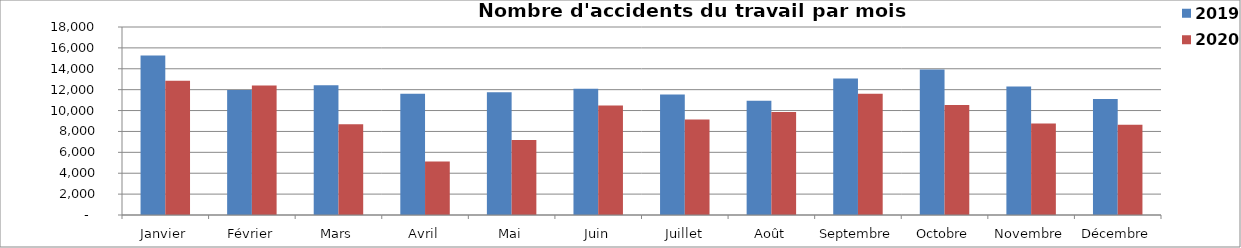
| Category | 2019 | 2020 |
|---|---|---|
| Janvier | 15269 | 12863 |
| Février | 11960 | 12403 |
| Mars | 12420 | 8677 |
| Avril | 11615 | 5124 |
| Mai | 11763 | 7185 |
| Juin | 12089 | 10491 |
| Juillet | 11533 | 9141 |
| Août | 10929 | 9853 |
| Septembre | 13074 | 11621 |
| Octobre | 13942 | 10529 |
| Novembre | 12310 | 8761 |
| Décembre | 11099 | 8651 |